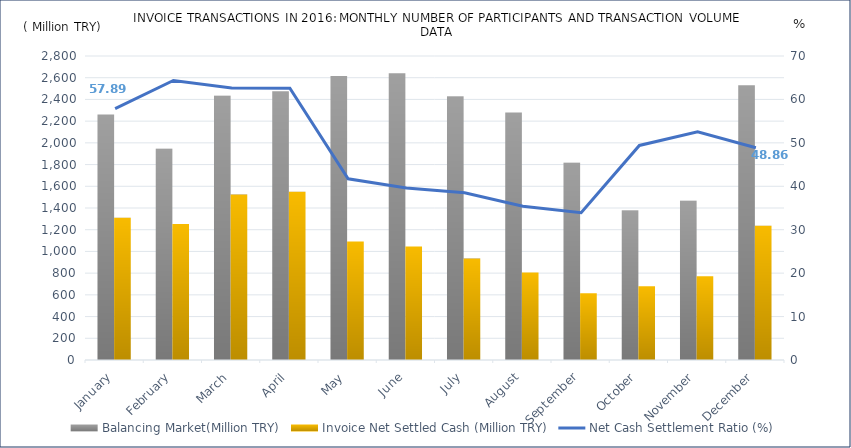
| Category | Balancing Market(Million TRY) | Invoice Net Settled Cash (Million TRY) |
|---|---|---|
| January | 2261.944 | 1309.441 |
| February | 1946.07 | 1252.537 |
| March | 2434.252 | 1524.247 |
| April | 2475.51 | 1549.478 |
| May | 2616.611 | 1091.807 |
| June | 2640.537 | 1046.052 |
| July | 2426.561 | 934.81 |
| August | 2280.466 | 806.977 |
| September | 1816.803 | 615.94 |
| October | 1375.875 | 679.74 |
| November | 1467.509 | 771.361 |
| December | 2530.357 | 1236.401 |